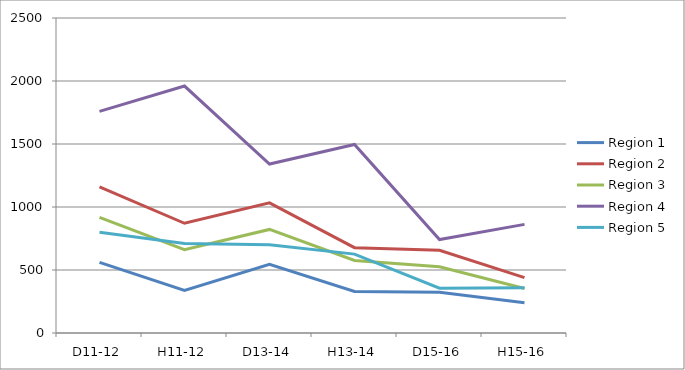
| Category | Region 1 | Region 2 | Region 3 | Region 4 | Region 5 |
|---|---|---|---|---|---|
| D11-12 | 560 | 1160 | 917 | 1759 | 799 |
| H11-12 | 338 | 871 | 661 | 1960 | 711 |
| D13-14 | 546 | 1033 | 822 | 1341 | 700 |
| H13-14 | 330 | 677 | 576 | 1496 | 626 |
| D15-16 | 324 | 657 | 525 | 742 | 356 |
| H15-16 | 240 | 440 | 353 | 862 | 359 |